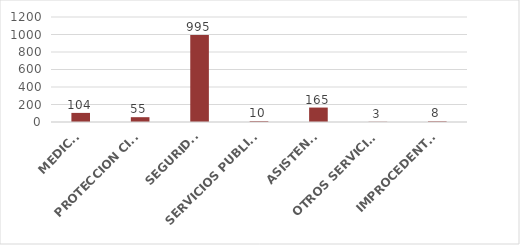
| Category | TOTAL |
|---|---|
| MEDICO | 104 |
| PROTECCION CIVIL | 55 |
| SEGURIDAD | 995 |
| SERVICIOS PUBLICOS | 10 |
| ASISTENCIA | 165 |
| OTROS SERVICIOS | 3 |
| IMPROCEDENTES | 8 |